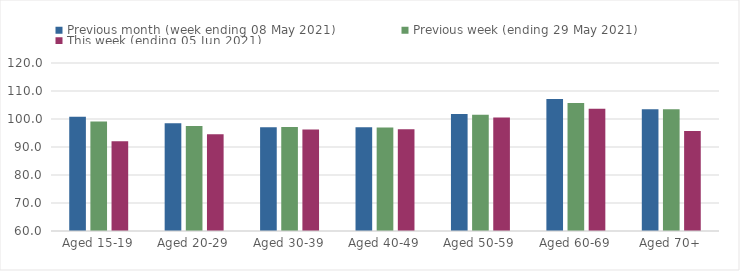
| Category | Previous month (week ending 08 May 2021) | Previous week (ending 29 May 2021) | This week (ending 05 Jun 2021) |
|---|---|---|---|
| Aged 15-19 | 100.79 | 99.1 | 92.04 |
| Aged 20-29 | 98.48 | 97.49 | 94.57 |
| Aged 30-39 | 97.03 | 97.18 | 96.24 |
| Aged 40-49 | 97.05 | 96.94 | 96.35 |
| Aged 50-59 | 101.83 | 101.55 | 100.57 |
| Aged 60-69 | 107.18 | 105.72 | 103.62 |
| Aged 70+ | 103.47 | 103.47 | 95.74 |